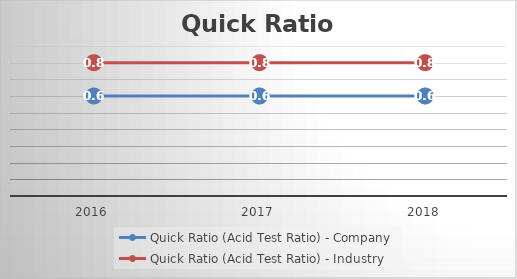
| Category | Quick Ratio (Acid Test Ratio) - Company | Quick Ratio (Acid Test Ratio) - Industry |
|---|---|---|
| 2016.0 | 0.6 | 0.8 |
| 2017.0 | 0.6 | 0.8 |
| 2018.0 | 0.6 | 0.8 |